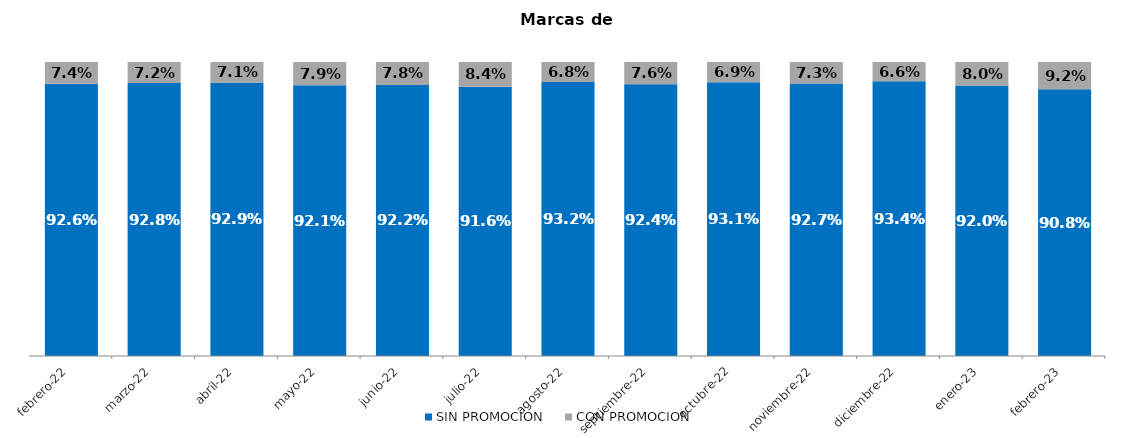
| Category | SIN PROMOCION   | CON PROMOCION   |
|---|---|---|
| 2022-02-01 | 0.926 | 0.074 |
| 2022-03-01 | 0.928 | 0.072 |
| 2022-04-01 | 0.929 | 0.071 |
| 2022-05-01 | 0.921 | 0.079 |
| 2022-06-01 | 0.922 | 0.078 |
| 2022-07-01 | 0.916 | 0.084 |
| 2022-08-01 | 0.932 | 0.068 |
| 2022-09-01 | 0.924 | 0.076 |
| 2022-10-01 | 0.931 | 0.069 |
| 2022-11-01 | 0.927 | 0.073 |
| 2022-12-01 | 0.934 | 0.066 |
| 2023-01-01 | 0.92 | 0.08 |
| 2023-02-01 | 0.908 | 0.092 |